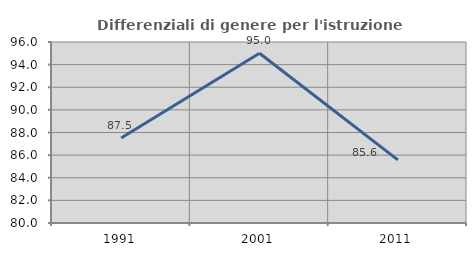
| Category | Differenziali di genere per l'istruzione superiore |
|---|---|
| 1991.0 | 87.512 |
| 2001.0 | 95 |
| 2011.0 | 85.58 |